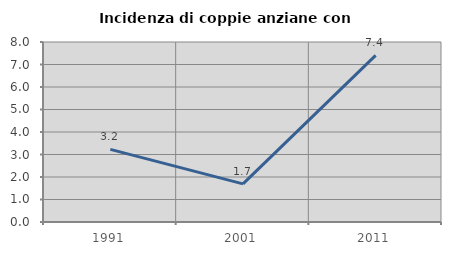
| Category | Incidenza di coppie anziane con figli |
|---|---|
| 1991.0 | 3.226 |
| 2001.0 | 1.695 |
| 2011.0 | 7.407 |